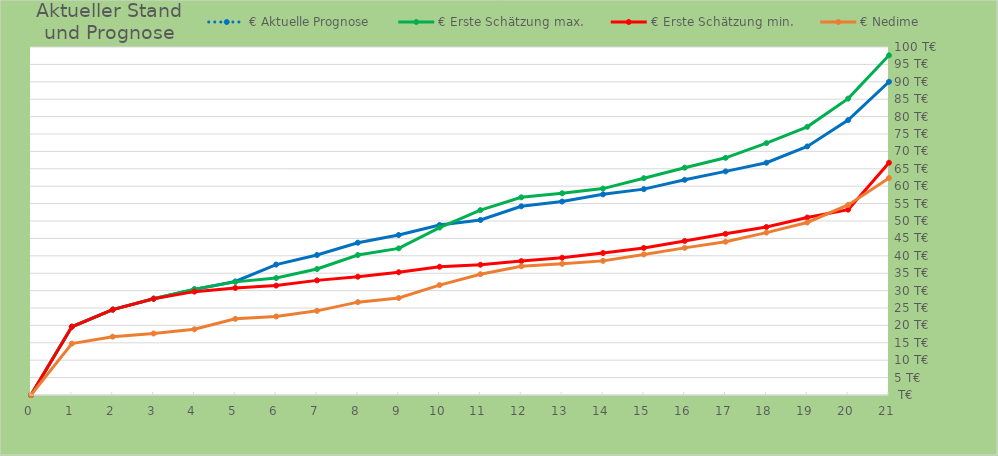
| Category | € Aktuelle Prognose | € Erste Schätzung max. | € Erste Schätzung min. | € Nedime |
|---|---|---|---|---|
| 0.0 | 0 | 0 | 0 | 0 |
| 1.0 | 19612 | 19612 | 19612 | 14771 |
| 2.0 | 24532 | 24532 | 24532 | 16764 |
| 3.0 | 27671 | 27671 | 27671 | 17674 |
| 4.0 | 30324 | 30432.234 | 29701.246 | 18881 |
| 5.0 | 32621 | 32506.378 | 30756.894 | 21886 |
| 6.0 | 37481 | 33608.619 | 31437.773 | 22571 |
| 7.0 | 40223 | 36197.679 | 32936.512 | 24180 |
| 8.0 | 43766 | 40218.847 | 33994.839 | 26679 |
| 9.0 | 45971 | 42132.08 | 35272.199 | 27868 |
| 10.0 | 48853 | 48116.364 | 36856.34 | 31587 |
| 11.0 | 50284 | 53130.353 | 37437.416 | 34703 |
| 12.0 | 54218 | 56803.953 | 38472.968 | 36986 |
| 13.0 | 55585 | 57959.295 | 39446.897 | 37704 |
| 14.0 | 57658 | 59306.121 | 40802.293 | 38541 |
| 15.0 | 59154 | 62299.067 | 42261.511 | 40401 |
| 16.0 | 61842 | 65317.759 | 44266.304 | 42277 |
| 17.0 | 64258 | 68153.013 | 46307.602 | 44039 |
| 18.0 | 66749 | 72372.102 | 48274.55 | 46661 |
| 19.0 | 71433 | 77062.66 | 50994.718 | 49576 |
| 20.0 | 78993 | 85166.143 | 53266.102 | 54612 |
| 21.0 | 90001 | 97609.398 | 66735.323 | 62345 |